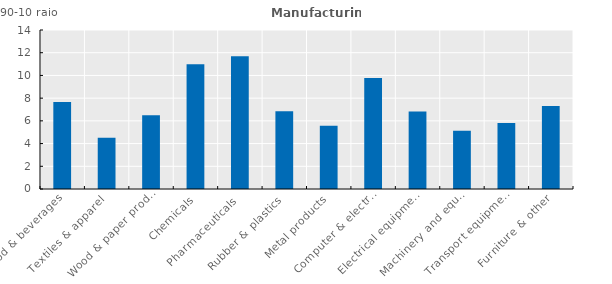
| Category | Series 0 |
|---|---|
| Food & beverages | 7.671 |
| Textiles & apparel  | 4.503 |
| Wood & paper prod.  | 6.504 |
| Chemicals | 10.985 |
| Pharmaceuticals  | 11.685 |
| Rubber & plastics  | 6.845 |
| Metal products | 5.566 |
| Computer & electronics  | 9.774 |
| Electrical equipment | 6.816 |
| Machinery and equipment | 5.126 |
| Transport equipment  | 5.81 |
| Furniture & other | 7.305 |